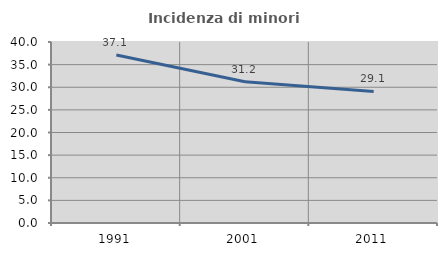
| Category | Incidenza di minori stranieri |
|---|---|
| 1991.0 | 37.143 |
| 2001.0 | 31.21 |
| 2011.0 | 29.084 |